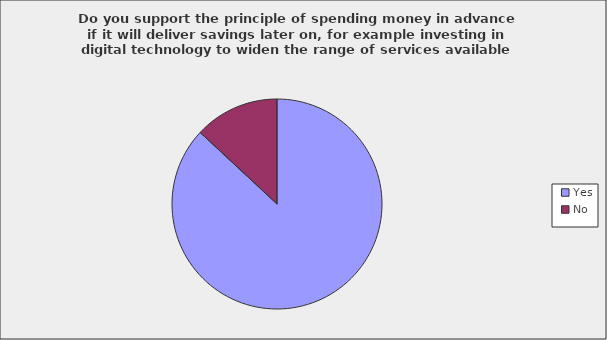
| Category | Series 0 |
|---|---|
| Yes | 0.869 |
| No | 0.131 |